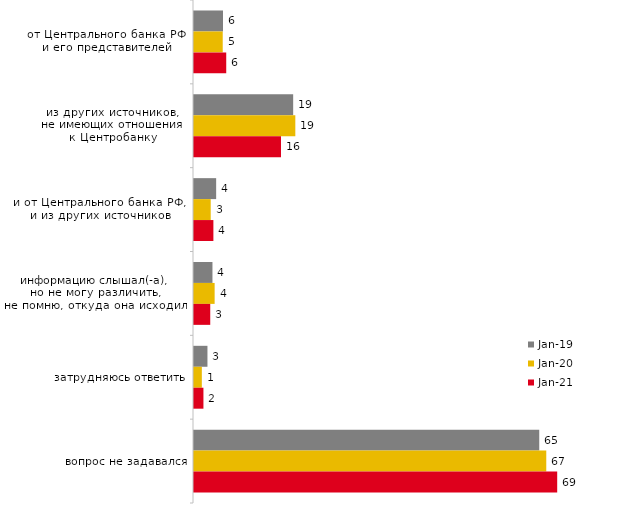
| Category | янв.19 | янв.20 | янв.21 |
|---|---|---|---|
| от Центрального банка РФ 
и его представителей | 5.5 | 5.446 | 6.11 |
| из других источников, 
не имеющих отношения 
к Центробанку | 18.8 | 19.208 | 16.493 |
| и от Центрального банка РФ, 
и из других источников | 4.2 | 3.168 | 3.676 |
| информацию слышал(-а), 
но не могу различить, 
не помню, откуда она исходила | 3.5 | 3.911 | 3.08 |
| затрудняюсь ответить | 2.55 | 1.485 | 1.788 |
| вопрос не задавался | 65.45 | 66.782 | 68.852 |